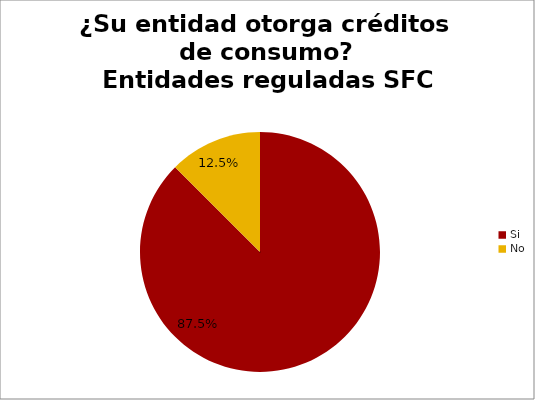
| Category | ¿Su entidad otorga créditos de consumo? Entidades reguladas SFC |
|---|---|
| Si | 0.875 |
| No | 0.125 |